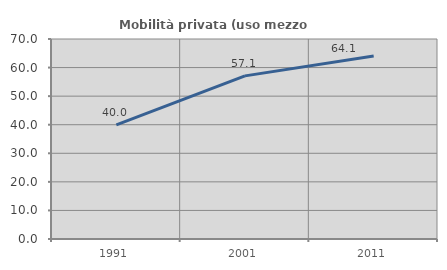
| Category | Mobilità privata (uso mezzo privato) |
|---|---|
| 1991.0 | 39.974 |
| 2001.0 | 57.092 |
| 2011.0 | 64.084 |